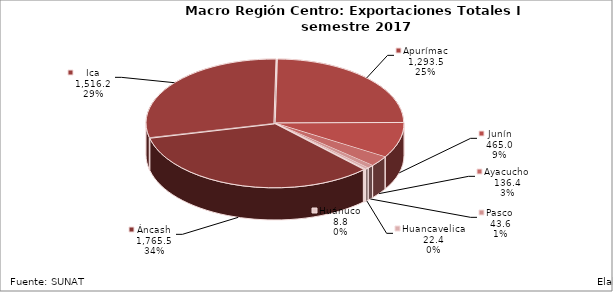
| Category | Series 0 |
|---|---|
| Áncash | 1765.547 |
| Ica | 1516.152 |
| Apurímac | 1293.534 |
| Junín | 465 |
| Ayacucho | 136.392 |
| Pasco | 43.561 |
| Huancavelica | 22.433 |
| Huánuco | 8.828 |